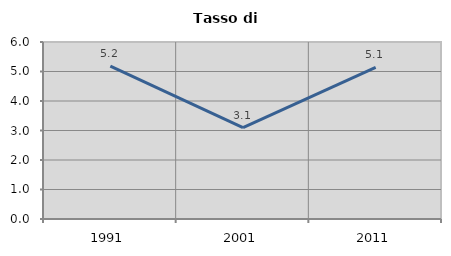
| Category | Tasso di disoccupazione   |
|---|---|
| 1991.0 | 5.182 |
| 2001.0 | 3.1 |
| 2011.0 | 5.143 |